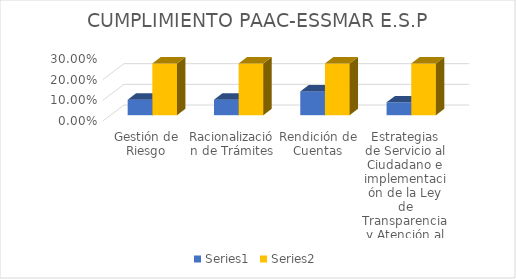
| Category | Series 4 | Series 5 |
|---|---|---|
| Gestión de Riesgo | 0.075 | 0.25 |
| Racionalización de Trámites | 0.075 | 0.25 |
| Rendición de Cuentas | 0.115 | 0.25 |
| Estrategias de Servicio al Ciudadano e implementación de la Ley de Transparencia y Atención al Ciudadano | 0.062 | 0.25 |